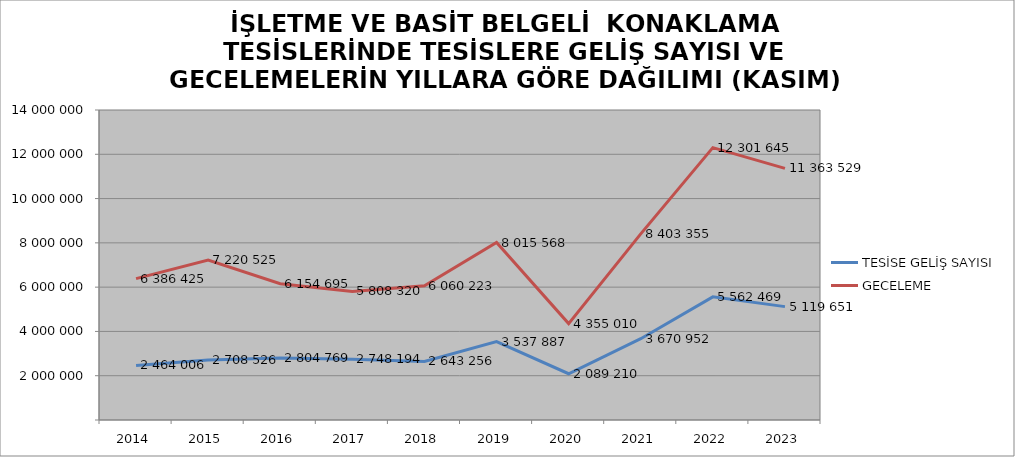
| Category | TESİSE GELİŞ SAYISI | GECELEME |
|---|---|---|
| 2014 | 2464006 | 6386425 |
| 2015 | 2708526 | 7220525 |
| 2016 | 2804769 | 6154695 |
| 2017 | 2748194 | 5808320 |
| 2018 | 2643256 | 6060223 |
| 2019 | 3537887 | 8015568 |
| 2020 | 2089210 | 4355010 |
| 2021 | 3670952 | 8403355 |
| 2022 | 5562469 | 12301645 |
| 2023 | 5119651 | 11363529 |